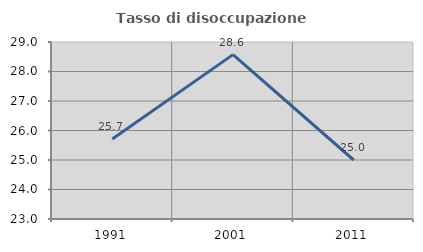
| Category | Tasso di disoccupazione giovanile  |
|---|---|
| 1991.0 | 25.714 |
| 2001.0 | 28.571 |
| 2011.0 | 25 |